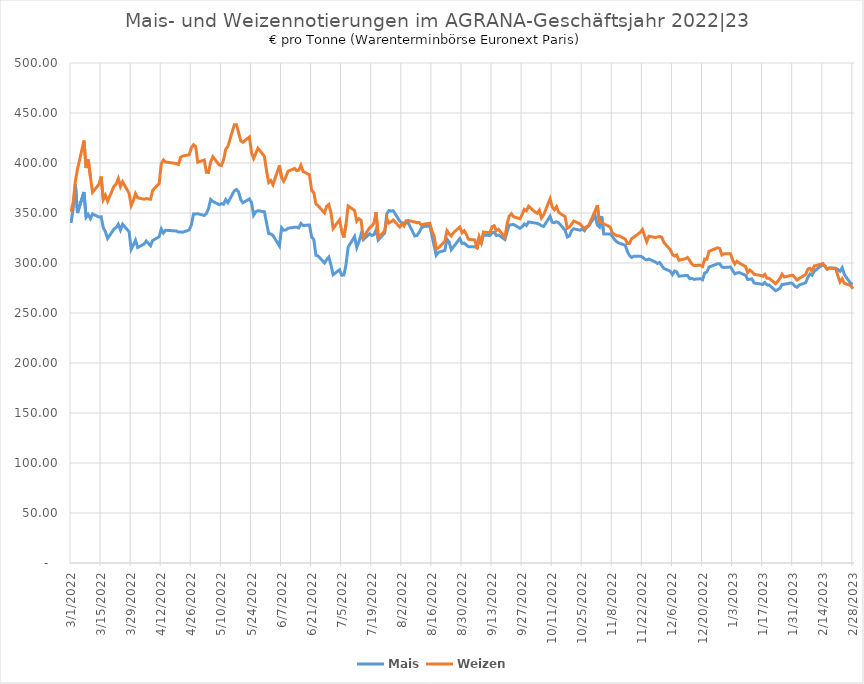
| Category |  Mais  |  Weizen  |
|---|---|---|
| 3/1/22 | 340 | 351.25 |
| 3/2/22 | 355 | 361 |
| 3/3/22 | 379 | 381.75 |
| 3/4/22 | 350 | 393.75 |
| 3/7/22 | 371 | 422.5 |
| 3/8/22 | 345.75 | 395 |
| 3/9/22 | 348.5 | 403.5 |
| 3/10/22 | 344.25 | 386.25 |
| 3/11/22 | 349 | 370.75 |
| 3/14/22 | 346 | 378.75 |
| 3/15/22 | 346.25 | 386.5 |
| 3/16/22 | 335.25 | 363.5 |
| 3/17/22 | 331.25 | 367.75 |
| 3/18/22 | 324.5 | 361.75 |
| 3/21/22 | 334 | 376.75 |
| 3/22/22 | 335.5 | 379 |
| 3/23/22 | 338.75 | 384.5 |
| 3/24/22 | 333 | 376.5 |
| 3/25/22 | 338.75 | 381.25 |
| 3/28/22 | 331.25 | 369.75 |
| 3/29/22 | 313.75 | 357.5 |
| 3/30/22 | 318 | 362.5 |
| 3/31/22 | 322.75 | 369.5 |
| 4/1/22 | 315.5 | 365.25 |
| 4/4/22 | 319 | 363.75 |
| 4/5/22 | 322 | 364.5 |
| 4/6/22 | 319.5 | 364 |
| 4/7/22 | 317.25 | 363.75 |
| 4/8/22 | 322.5 | 372.75 |
| 4/11/22 | 326.25 | 379.5 |
| 4/12/22 | 334 | 399.25 |
| 4/13/22 | 330 | 403 |
| 4/14/22 | 332.75 | 401 |
| 4/19/22 | 332 | 399.5 |
| 4/20/22 | 331 | 398.5 |
| 4/21/22 | 331 | 405.75 |
| 4/22/22 | 330.75 | 407 |
| 4/25/22 | 333 | 408.25 |
| 4/26/22 | 338 | 415.25 |
| 4/27/22 | 349 | 418.25 |
| 4/28/22 | 349 | 416.5 |
| 4/29/22 | 349.25 | 400.75 |
| 5/2/22 | 347.5 | 403 |
| 5/3/22 | 349.5 | 390.75 |
| 5/4/22 | 354.5 | 390.5 |
| 5/5/22 | 363.5 | 401 |
| 5/6/22 | 361.5 | 406.25 |
| 5/9/22 | 358.25 | 398 |
| 5/10/22 | 359.5 | 397.5 |
| 5/11/22 | 358.75 | 403.25 |
| 5/12/22 | 363.5 | 413.75 |
| 5/13/22 | 360.25 | 416.5 |
| 5/16/22 | 372.25 | 438.25 |
| 5/17/22 | 373.5 | 438.25 |
| 5/18/22 | 371 | 430.5 |
| 5/19/22 | 363.25 | 422.25 |
| 5/20/22 | 360.25 | 420.75 |
| 5/23/22 | 364 | 426 |
| 5/24/22 | 360.5 | 410.5 |
| 5/25/22 | 347.75 | 404.5 |
| 5/26/22 | 351.25 | 409.5 |
| 5/27/22 | 352.25 | 414.75 |
| 5/30/22 | 351.25 | 406.75 |
| 5/31/22 | 340.25 | 392.25 |
| 6/1/22 | 329.5 | 380.5 |
| 6/2/22 | 329 | 382.5 |
| 6/3/22 | 327.5 | 378.25 |
| 6/6/22 | 317 | 397.5 |
| 6/7/22 | 335.25 | 385.5 |
| 6/8/22 | 332.75 | 381.75 |
| 6/9/22 | 333 | 386.25 |
| 6/10/22 | 334.75 | 391.75 |
| 6/13/22 | 335.75 | 394.5 |
| 6/14/22 | 335.75 | 392.25 |
| 6/15/22 | 335 | 392.75 |
| 6/16/22 | 339.5 | 397.75 |
| 6/17/22 | 337.5 | 391.5 |
| 6/20/22 | 338 | 388.25 |
| 6/21/22 | 326 | 372.5 |
| 6/22/22 | 323.5 | 370.5 |
| 6/23/22 | 307.75 | 359 |
| 6/24/22 | 307 | 357.25 |
| 6/27/22 | 300 | 350 |
| 6/28/22 | 303.5 | 356.75 |
| 6/29/22 | 306 | 358.5 |
| 6/30/22 | 298 | 350.25 |
| 7/1/22 | 288.25 | 334.5 |
| 7/4/22 | 293.25 | 343.25 |
| 7/5/22 | 287.75 | 331.75 |
| 7/6/22 | 288 | 325.5 |
| 7/7/22 | 298.25 | 338.75 |
| 7/8/22 | 316 | 357 |
| 7/11/22 | 326.5 | 352.5 |
| 7/12/22 | 315.5 | 341.75 |
| 7/13/22 | 321 | 344.25 |
| 7/14/22 | 328.75 | 342.75 |
| 7/15/22 | 323.25 | 325.5 |
| 7/18/22 | 329.25 | 335.25 |
| 7/19/22 | 327.5 | 337 |
| 7/20/22 | 328.5 | 340 |
| 7/21/22 | 333.25 | 350.75 |
| 7/22/22 | 323 | 325.75 |
| 7/25/22 | 330 | 331.75 |
| 7/26/22 | 349.25 | 344.5 |
| 7/27/22 | 352.5 | 340 |
| 7/28/22 | 352 | 341.25 |
| 7/29/22 | 352.25 | 343 |
| 8/1/22 | 342 | 336 |
| 8/2/22 | 340 | 339 |
| 8/3/22 | 340 | 337 |
| 8/4/22 | 340 | 342.25 |
| 8/5/22 | 340 | 342.5 |
| 8/8/22 | 327 | 341 |
| 8/9/22 | 327.5 | 340.25 |
| 8/10/22 | 330.5 | 340.5 |
| 8/11/22 | 334.75 | 338 |
| 8/12/22 | 336.5 | 338.75 |
| 8/15/22 | 337 | 339.75 |
| 8/16/22 | 327.75 | 332 |
| 8/17/22 | 317.5 | 327.25 |
| 8/18/22 | 307.75 | 313.75 |
| 8/19/22 | 310.75 | 315 |
| 8/22/22 | 312.5 | 321.5 |
| 8/23/22 | 323.75 | 332.25 |
| 8/24/22 | 321 | 329.25 |
| 8/25/22 | 313.25 | 327 |
| 8/26/22 | 316 | 330.25 |
| 8/29/22 | 324.5 | 336 |
| 8/30/22 | 319.5 | 330.25 |
| 8/31/22 | 320 | 332.25 |
| 9/1/22 | 318 | 328.75 |
| 9/2/22 | 316.25 | 323.75 |
| 9/5/22 | 316.25 | 323 |
| 9/6/22 | 315 | 314.25 |
| 9/7/22 | 323.5 | 326.25 |
| 9/8/22 | 320 | 320.5 |
| 9/9/22 | 328 | 331 |
| 9/12/22 | 327.5 | 330.25 |
| 9/13/22 | 330.25 | 336.25 |
| 9/14/22 | 330.75 | 337.25 |
| 9/15/22 | 327.5 | 332.25 |
| 9/16/22 | 328 | 333.75 |
| 9/19/22 | 323.5 | 325.75 |
| 9/20/22 | 331.25 | 339.25 |
| 9/21/22 | 338 | 347 |
| 9/22/22 | 338.25 | 349.25 |
| 9/23/22 | 338.5 | 346.25 |
| 9/26/22 | 334.75 | 344.25 |
| 9/27/22 | 336.25 | 348.5 |
| 9/28/22 | 339 | 353.75 |
| 9/29/22 | 337.5 | 352.25 |
| 9/30/22 | 341 | 356.75 |
| 10/3/22 | 340 | 351 |
| 10/4/22 | 339.75 | 349.75 |
| 10/5/22 | 338.75 | 352.75 |
| 10/6/22 | 337.25 | 345 |
| 10/7/22 | 336.5 | 348 |
| 10/10/22 | 346.75 | 364.25 |
| 10/11/22 | 340.75 | 356 |
| 10/12/22 | 340.25 | 353.25 |
| 10/13/22 | 341.25 | 356.25 |
| 10/14/22 | 340.25 | 350.75 |
| 10/17/22 | 332.75 | 346.25 |
| 10/18/22 | 326 | 334.75 |
| 10/19/22 | 327 | 336 |
| 10/20/22 | 332.25 | 338.75 |
| 10/21/22 | 334.25 | 342 |
| 10/24/22 | 332.75 | 339 |
| 10/25/22 | 334 | 336.5 |
| 10/26/22 | 332.25 | 334.25 |
| 10/27/22 | 335.25 | 336.5 |
| 10/28/22 | 337 | 337.5 |
| 10/31/22 | 347.25 | 352.25 |
| 11/1/22 | 338 | 357.75 |
| 11/2/22 | 336 | 341.25 |
| 11/3/22 | 346.75 | 340.75 |
| 11/4/22 | 329 | 339.25 |
| 11/7/22 | 329 | 336 |
| 11/8/22 | 326.75 | 330 |
| 11/9/22 | 323.5 | 328.75 |
| 11/10/22 | 321.25 | 327.25 |
| 11/11/22 | 320 | 327.25 |
| 11/14/22 | 317.75 | 324 |
| 11/15/22 | 311.5 | 319.5 |
| 11/16/22 | 307.5 | 319.75 |
| 11/17/22 | 305.5 | 324.5 |
| 11/18/22 | 306.75 | 325.75 |
| 11/21/22 | 306.75 | 330.75 |
| 11/22/22 | 306 | 333.5 |
| 11/23/22 | 304 | 327.25 |
| 11/24/22 | 303 | 321.25 |
| 11/25/22 | 304 | 326.75 |
| 11/28/22 | 301 | 325.5 |
| 11/29/22 | 299.5 | 326 |
| 11/30/22 | 300.5 | 326.5 |
| 12/1/22 | 297.5 | 325.75 |
| 12/2/22 | 294.5 | 320.5 |
| 12/5/22 | 291.75 | 313.25 |
| 12/6/22 | 288.5 | 308.25 |
| 12/7/22 | 292 | 307 |
| 12/8/22 | 291 | 308 |
| 12/9/22 | 286.75 | 302.75 |
| 12/12/22 | 287.5 | 304.25 |
| 12/13/22 | 287.5 | 305.5 |
| 12/14/22 | 284.25 | 302.5 |
| 12/15/22 | 284.5 | 299 |
| 12/16/22 | 283.75 | 297.5 |
| 12/19/22 | 284.25 | 297.75 |
| 12/20/22 | 283.25 | 296.5 |
| 12/21/22 | 290 | 304 |
| 12/22/22 | 291 | 303.75 |
| 12/23/22 | 296 | 311.75 |
| 12/27/22 | 299.25 | 315.25 |
| 12/28/22 | 299.25 | 314.5 |
| 12/29/22 | 296 | 308 |
| 12/30/22 | 295.5 | 309.25 |
| 1/2/23 | 296 | 309.25 |
| 1/3/23 | 292.5 | 303 |
| 1/4/23 | 289.25 | 299 |
| 1/5/23 | 290 | 301.75 |
| 1/6/23 | 290.5 | 300 |
| 1/9/23 | 287.75 | 296.5 |
| 1/10/23 | 283.5 | 290.5 |
| 1/11/23 | 283.75 | 293 |
| 1/12/23 | 284 | 291.25 |
| 1/13/23 | 280 | 288.75 |
| 1/16/23 | 279 | 287.5 |
| 1/17/23 | 278.5 | 286.75 |
| 1/18/23 | 280.5 | 288.75 |
| 1/19/23 | 278 | 284.75 |
| 1/20/23 | 278 | 284.75 |
| 1/23/23 | 272.25 | 279.25 |
| 1/24/23 | 273.25 | 281.75 |
| 1/25/23 | 274.75 | 284.5 |
| 1/26/23 | 278.5 | 288.75 |
| 1/27/23 | 278.75 | 286 |
| 1/30/23 | 280 | 287.5 |
| 1/31/23 | 279.25 | 287.75 |
| 2/1/23 | 276.75 | 285.25 |
| 2/2/23 | 275.75 | 283 |
| 2/3/23 | 278 | 284.5 |
| 2/6/23 | 280.25 | 288.5 |
| 2/7/23 | 285.5 | 293.75 |
| 2/8/23 | 289 | 294.75 |
| 2/9/23 | 287.75 | 291.75 |
| 2/10/23 | 291.75 | 297 |
| 2/13/23 | 297 | 298.75 |
| 2/14/23 | 298 | 299.5 |
| 2/15/23 | 297 | 296.5 |
| 2/16/23 | 294 | 293.75 |
| 2/17/23 | 295 | 295 |
| 2/20/23 | 294.75 | 294.5 |
| 2/21/23 | 293.5 | 287 |
| 2/22/23 | 291.75 | 281 |
| 2/23/23 | 295.25 | 284.25 |
| 2/24/23 | 288.5 | 279.75 |
| 2/27/23 | 279.5 | 277.5 |
| 2/28/23 | 279.25 | 274.25 |